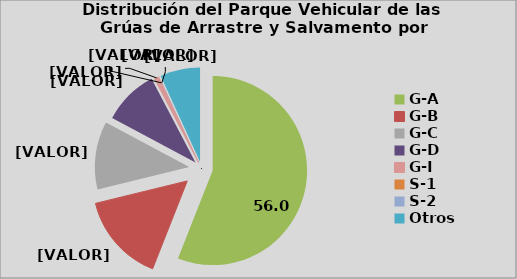
| Category | Series 0 |
|---|---|
| G-A | 55.981 |
| G-B | 15.2 |
| G-C | 11.628 |
| G-D | 9.495 |
| G-I | 0.755 |
| S-1 | 0.009 |
| S-2 | 0.097 |
| Otros | 6.836 |